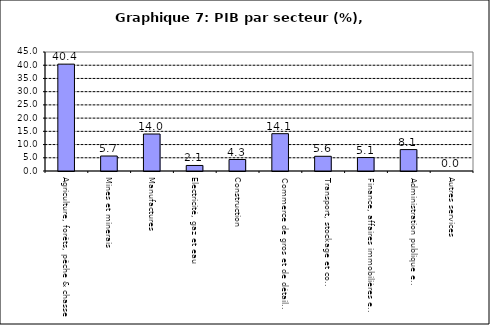
| Category | Series 0 |
|---|---|
| Agriculture, forêts, pêche & chasse | 40.414 |
| Mines et minerais | 5.669 |
| Manufactures | 13.988 |
| Electricité, gaz et eau | 2.093 |
| Construction | 4.344 |
| Commerce de gros et de détail, hôtels et restaurants | 14.113 |
| Transport, stockage et communications                | 5.563 |
| Finance, affaires immobilières et services | 5.078 |
| Administration publique et defense       | 8.098 |
| Autres services                        | 0 |